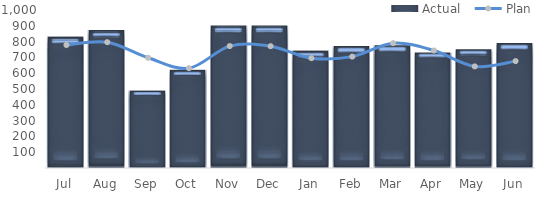
| Category | Actual |
|---|---|
| Jul | 832048 |
| Aug | 873264 |
| Sep | 489762 |
| Oct | 621690 |
| Nov | 902520 |
| Dec | 901968 |
| Jan | 742900 |
| Feb | 772800 |
| Mar | 777400 |
| Apr | 731400 |
| May | 752100 |
| Jun | 791200 |